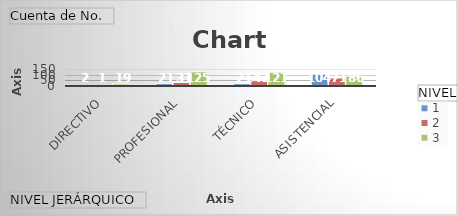
| Category | 1 | 2 | 3 |
|---|---|---|---|
| DIRECTIVO | 2 | 1 | 19 |
| PROFESIONAL | 21 | 31 | 125 |
| TÉCNICO | 21 | 47 | 121 |
| ASISTENCIAL | 104 | 71 | 86 |